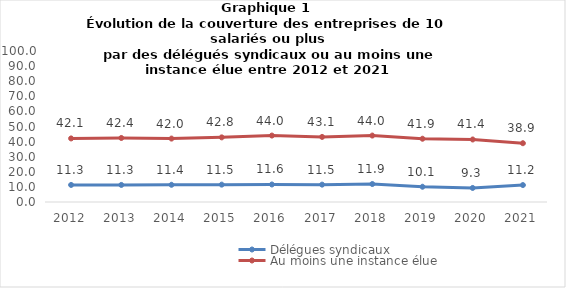
| Category | Délégues syndicaux | Au moins une instance élue |
|---|---|---|
| 2012.0 | 11.3 | 42.1 |
| 2013.0 | 11.3 | 42.4 |
| 2014.0 | 11.4 | 42 |
| 2015.0 | 11.5 | 42.8 |
| 2016.0 | 11.6 | 44 |
| 2017.0 | 11.5 | 43.1 |
| 2018.0 | 11.9 | 44 |
| 2019.0 | 10.1 | 41.9 |
| 2020.0 | 9.3 | 41.4 |
| 2021.0 | 11.22 | 38.93 |